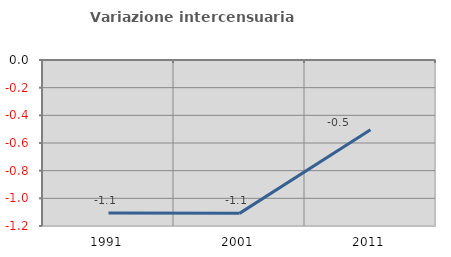
| Category | Variazione intercensuaria annua |
|---|---|
| 1991.0 | -1.107 |
| 2001.0 | -1.109 |
| 2011.0 | -0.504 |